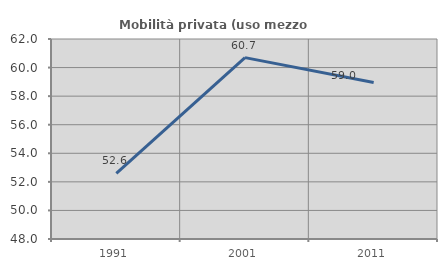
| Category | Mobilità privata (uso mezzo privato) |
|---|---|
| 1991.0 | 52.599 |
| 2001.0 | 60.696 |
| 2011.0 | 58.957 |